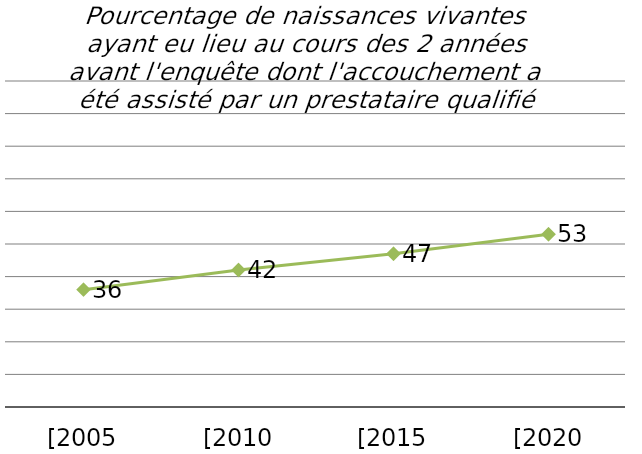
| Category | Prestataire qualifié |
|---|---|
| [2005 xDHS] | 36 |
| [2010 xDHS] | 42 |
| [2015 xDHS] | 47 |
| [2020 xDHS] | 53 |